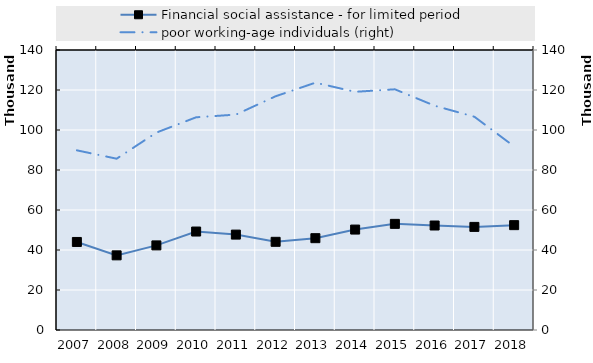
| Category | Financial social assistance - for limited period | Series 4 | Series 5 | Series 6 | Series 7 | Series 8 | Series 9 | Series 10 | Series 11 | Series 12 | Series 13 | Series 14 | Series 15 | Series 16 | Series 17 | Series 18 | Series 19 |
|---|---|---|---|---|---|---|---|---|---|---|---|---|---|---|---|---|---|
| 2007.0 | 44018 |  |  |  |  |  |  |  |  |  |  |  |  |  |  |  |  |
| 2008.0 | 37324 |  |  |  |  |  |  |  |  |  |  |  |  |  |  |  |  |
| 2009.0 | 42300 |  |  |  |  |  |  |  |  |  |  |  |  |  |  |  |  |
| 2010.0 | 49234 |  |  |  |  |  |  |  |  |  |  |  |  |  |  |  |  |
| 2011.0 | 47703 |  |  |  |  |  |  |  |  |  |  |  |  |  |  |  |  |
| 2012.0 | 44088 |  |  |  |  |  |  |  |  |  |  |  |  |  |  |  |  |
| 2013.0 | 45913 |  |  |  |  |  |  |  |  |  |  |  |  |  |  |  |  |
| 2014.0 | 50211 |  |  |  |  |  |  |  |  |  |  |  |  |  |  |  |  |
| 2015.0 | 53069 |  |  |  |  |  |  |  |  |  |  |  |  |  |  |  |  |
| 2016.0 | 52250 |  |  |  |  |  |  |  |  |  |  |  |  |  |  |  |  |
| 2017.0 | 51553 |  |  |  |  |  |  |  |  |  |  |  |  |  |  |  |  |
| 2018.0 | 52429 |  |  |  |  |  |  |  |  |  |  |  |  |  |  |  |  |